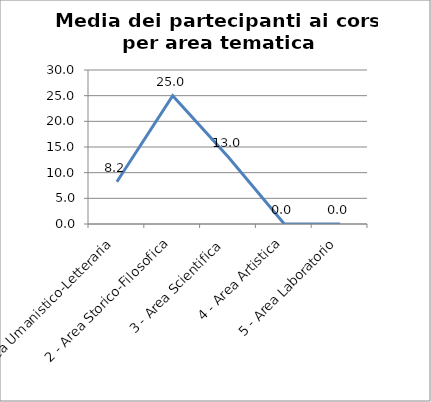
| Category | Media dei partecipanti ai corsi |
|---|---|
| 1 - Area Umanistico-Letteraria | 8.227 |
| 2 - Area Storico-Filosofica | 25 |
| 3 - Area Scientifica | 13 |
| 4 - Area Artistica | 0 |
| 5 - Area Laboratorio | 0 |